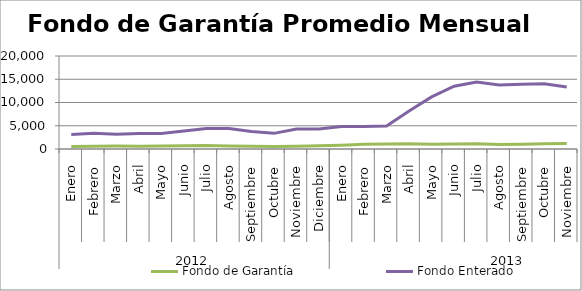
| Category | Fondo de Garantía | Fondo Enterado |
|---|---|---|
| 0 | 560.173 | 3141.641 |
| 1 | 575.916 | 3362.648 |
| 2 | 622.075 | 3154.118 |
| 3 | 612.299 | 3348.058 |
| 4 | 654.277 | 3308.859 |
| 5 | 675.965 | 3850.375 |
| 6 | 729.97 | 4400.539 |
| 7 | 649.095 | 4383.327 |
| 8 | 606.03 | 3757.632 |
| 9 | 525.314 | 3362.932 |
| 10 | 591.646 | 4285.609 |
| 11 | 703.403 | 4296.87 |
| 12 | 823.344 | 4842.786 |
| 13 | 1008.855 | 4845.136 |
| 14 | 1091.101 | 4938.365 |
| 15 | 1128.09 | 8179.666 |
| 16 | 1047.818 | 11202.213 |
| 17 | 1079.154 | 13493.433 |
| 18 | 1130.244 | 14387.844 |
| 19 | 950.791 | 13769.803 |
| 20 | 1002.474 | 13899.147 |
| 21 | 1106.654 | 14005.922 |
| 22 | 1178.354 | 13346.59 |